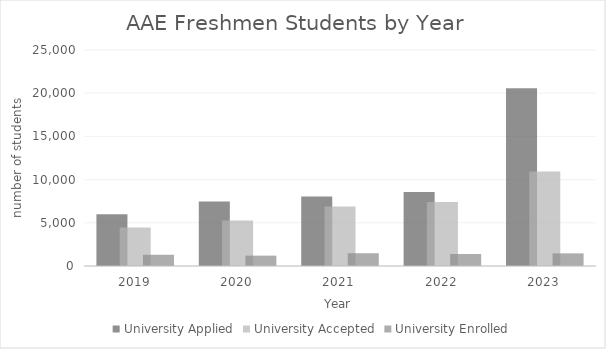
| Category | University |
|---|---|
| 2019.0 | 1301 |
| 2020.0 | 1201 |
| 2021.0 | 1479 |
| 2022.0 | 1388 |
| 2023.0 | 1463 |